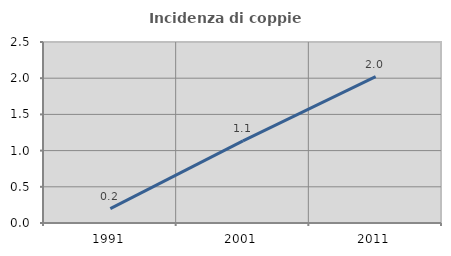
| Category | Incidenza di coppie miste |
|---|---|
| 1991.0 | 0.199 |
| 2001.0 | 1.134 |
| 2011.0 | 2.021 |